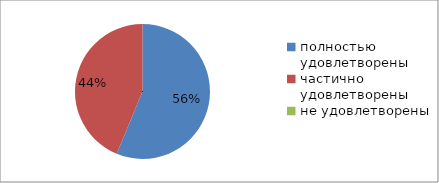
| Category | Series 0 |
|---|---|
| полностью удовлетворены | 56.3 |
| частично удовлетворены | 43.8 |
| не удовлетворены | 0 |